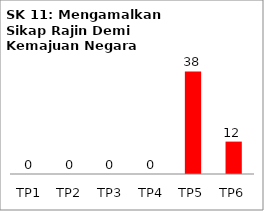
| Category | Bil Pel |
|---|---|
| TP1 | 0 |
| TP2 | 0 |
| TP3 | 0 |
| TP4 | 0 |
| TP5 | 38 |
| TP6 | 12 |